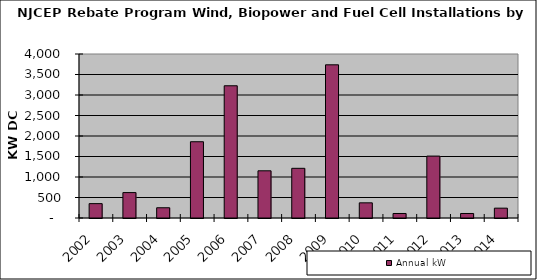
| Category | Annual kW |
|---|---|
| 2002.0 | 350.38 |
| 2003.0 | 620 |
| 2004.0 | 250 |
| 2005.0 | 1860 |
| 2006.0 | 3225 |
| 2007.0 | 1151 |
| 2008.0 | 1211.8 |
| 2009.0 | 3735.9 |
| 2010.0 | 370 |
| 2011.0 | 110 |
| 2012.0 | 1510 |
| 2013.0 | 110 |
| 2014.0 | 240 |